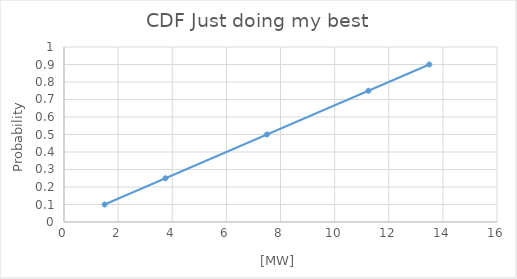
| Category | Actual frequency in percentage |
|---|---|
| 1.5 | 0.1 |
| 3.75 | 0.25 |
| 7.5 | 0.5 |
| 11.25 | 0.75 |
| 13.5 | 0.9 |